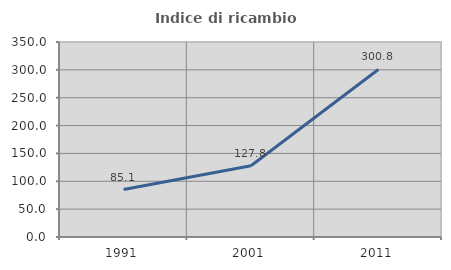
| Category | Indice di ricambio occupazionale  |
|---|---|
| 1991.0 | 85.135 |
| 2001.0 | 127.778 |
| 2011.0 | 300.752 |